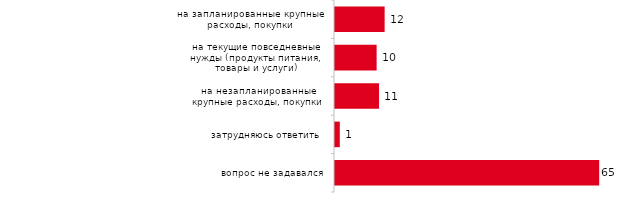
| Category | Series 0 |
|---|---|
| на запланированные крупные расходы, покупки | 12.277 |
| на текущие повседневные нужды (продукты питания, товары и услуги) | 10.297 |
| на незапланированные крупные расходы, покупки | 10.891 |
| затрудняюсь ответить | 1.188 |
| вопрос не задавался | 65.347 |